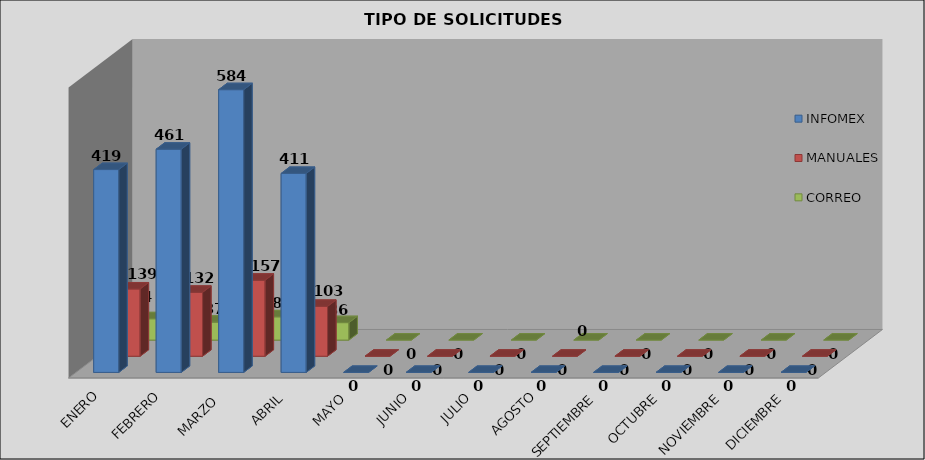
| Category | INFOMEX | MANUALES | CORREO |
|---|---|---|---|
| ENERO | 419 | 139 | 44 |
| FEBRERO | 461 | 132 | 37 |
| MARZO  | 584 | 157 | 48 |
| ABRIL | 411 | 103 | 36 |
| MAYO | 0 | 0 | 0 |
| JUNIO | 0 | 0 | 0 |
| JULIO | 0 | 0 | 0 |
| AGOSTO | 0 | 0 | 0 |
| SEPTIEMBRE | 0 | 0 | 0 |
| OCTUBRE | 0 | 0 | 0 |
| NOVIEMBRE | 0 | 0 | 0 |
| DICIEMBRE | 0 | 0 | 0 |